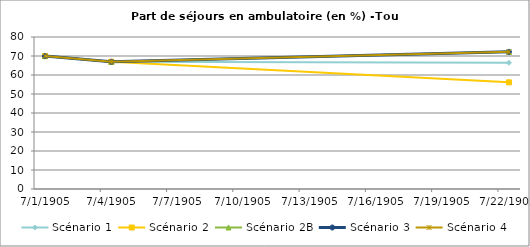
| Category | Scénario 1 | Scénario 2 | Scénario 2B | Scénario 3 | Scénario 4 |
|---|---|---|---|---|---|
| 2009.0 | 69.957 | 69.957 | 69.957 | 69.957 | 69.957 |
| 2012.0 | 66.948 | 66.948 | 66.948 | 66.948 | 66.948 |
| 2030.0 | 66.441 | 56.142 | 72.183 | 72.183 | 72.183 |